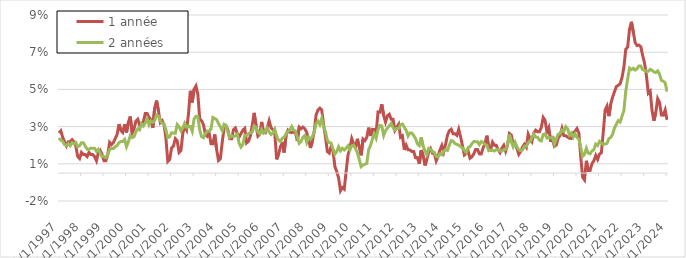
| Category | 1 année | 2 années |
|---|---|---|
| 1/1/97 | 0.022 | 0.019 |
| 2/1/97 | 0.023 | 0.018 |
| 3/1/97 | 0.019 | 0.017 |
| 4/1/97 | 0.017 | 0.015 |
| 5/1/97 | 0.015 | 0.015 |
| 6/1/97 | 0.017 | 0.016 |
| 7/1/97 | 0.017 | 0.015 |
| 8/1/97 | 0.018 | 0.016 |
| 9/1/97 | 0.017 | 0.016 |
| 10/1/97 | 0.015 | 0.016 |
| 11/1/97 | 0.009 | 0.014 |
| 12/1/97 | 0.008 | 0.015 |
| 1/1/98 | 0.011 | 0.016 |
| 2/1/98 | 0.01 | 0.016 |
| 3/1/98 | 0.01 | 0.015 |
| 4/1/98 | 0.009 | 0.013 |
| 5/1/98 | 0.011 | 0.013 |
| 6/1/98 | 0.01 | 0.013 |
| 7/1/98 | 0.01 | 0.013 |
| 8/1/98 | 0.009 | 0.013 |
| 9/1/98 | 0.007 | 0.012 |
| 10/1/98 | 0.011 | 0.013 |
| 11/1/98 | 0.012 | 0.011 |
| 12/1/98 | 0.01 | 0.009 |
| 1/1/99 | 0.007 | 0.009 |
| 2/1/99 | 0.007 | 0.008 |
| 3/1/99 | 0.01 | 0.01 |
| 4/1/99 | 0.016 | 0.013 |
| 5/1/99 | 0.015 | 0.013 |
| 6/1/99 | 0.016 | 0.013 |
| 7/1/99 | 0.019 | 0.014 |
| 8/1/99 | 0.021 | 0.015 |
| 9/1/99 | 0.026 | 0.016 |
| 10/1/99 | 0.023 | 0.017 |
| 11/1/99 | 0.022 | 0.017 |
| 12/1/99 | 0.026 | 0.018 |
| 1/1/00 | 0.022 | 0.014 |
| 2/1/00 | 0.027 | 0.017 |
| 3/1/00 | 0.03 | 0.02 |
| 4/1/00 | 0.022 | 0.019 |
| 5/1/00 | 0.024 | 0.02 |
| 6/1/00 | 0.028 | 0.022 |
| 7/1/00 | 0.029 | 0.024 |
| 8/1/00 | 0.026 | 0.023 |
| 9/1/00 | 0.027 | 0.027 |
| 10/1/00 | 0.028 | 0.025 |
| 11/1/00 | 0.032 | 0.027 |
| 12/1/00 | 0.032 | 0.029 |
| 1/1/01 | 0.03 | 0.026 |
| 2/1/01 | 0.029 | 0.028 |
| 3/1/01 | 0.024 | 0.027 |
| 4/1/01 | 0.035 | 0.028 |
| 5/1/01 | 0.039 | 0.031 |
| 6/1/01 | 0.034 | 0.031 |
| 7/1/01 | 0.027 | 0.028 |
| 8/1/01 | 0.028 | 0.027 |
| 9/1/01 | 0.026 | 0.026 |
| 10/1/01 | 0.019 | 0.023 |
| 11/1/01 | 0.006 | 0.019 |
| 12/1/01 | 0.007 | 0.02 |
| 1/1/02 | 0.013 | 0.022 |
| 2/1/02 | 0.014 | 0.022 |
| 3/1/02 | 0.019 | 0.021 |
| 4/1/02 | 0.017 | 0.026 |
| 5/1/02 | 0.011 | 0.025 |
| 6/1/02 | 0.012 | 0.023 |
| 7/1/02 | 0.021 | 0.024 |
| 8/1/02 | 0.025 | 0.027 |
| 9/1/02 | 0.023 | 0.025 |
| 10/1/02 | 0.032 | 0.025 |
| 11/1/02 | 0.044 | 0.025 |
| 12/1/02 | 0.038 | 0.022 |
| 1/1/03 | 0.045 | 0.029 |
| 2/1/03 | 0.047 | 0.031 |
| 3/1/03 | 0.042 | 0.03 |
| 4/1/03 | 0.029 | 0.023 |
| 5/1/03 | 0.028 | 0.02 |
| 6/1/03 | 0.026 | 0.019 |
| 7/1/03 | 0.021 | 0.021 |
| 8/1/03 | 0.02 | 0.023 |
| 9/1/03 | 0.022 | 0.023 |
| 10/1/03 | 0.016 | 0.024 |
| 11/1/03 | 0.016 | 0.03 |
| 12/1/03 | 0.021 | 0.029 |
| 1/1/04 | 0.013 | 0.029 |
| 2/1/04 | 0.007 | 0.027 |
| 3/1/04 | 0.008 | 0.025 |
| 4/1/04 | 0.017 | 0.023 |
| 5/1/04 | 0.024 | 0.026 |
| 6/1/04 | 0.025 | 0.026 |
| 7/1/04 | 0.023 | 0.022 |
| 8/1/04 | 0.018 | 0.019 |
| 9/1/04 | 0.018 | 0.02 |
| 10/1/04 | 0.023 | 0.02 |
| 11/1/04 | 0.024 | 0.02 |
| 12/1/04 | 0.021 | 0.021 |
| 1/1/05 | 0.019 | 0.016 |
| 2/1/05 | 0.021 | 0.014 |
| 3/1/05 | 0.023 | 0.015 |
| 4/1/05 | 0.024 | 0.02 |
| 5/1/05 | 0.016 | 0.02 |
| 6/1/05 | 0.017 | 0.021 |
| 7/1/05 | 0.02 | 0.022 |
| 8/1/05 | 0.026 | 0.022 |
| 9/1/05 | 0.032 | 0.025 |
| 10/1/05 | 0.026 | 0.025 |
| 11/1/05 | 0.02 | 0.022 |
| 12/1/05 | 0.021 | 0.021 |
| 1/1/06 | 0.028 | 0.023 |
| 2/1/06 | 0.022 | 0.022 |
| 3/1/06 | 0.022 | 0.022 |
| 4/1/06 | 0.024 | 0.024 |
| 5/1/06 | 0.028 | 0.022 |
| 6/1/06 | 0.024 | 0.021 |
| 7/1/06 | 0.023 | 0.022 |
| 8/1/06 | 0.021 | 0.024 |
| 9/1/06 | 0.007 | 0.02 |
| 10/1/06 | 0.01 | 0.018 |
| 11/1/06 | 0.014 | 0.017 |
| 12/1/06 | 0.017 | 0.019 |
| 1/1/07 | 0.011 | 0.019 |
| 2/1/07 | 0.02 | 0.021 |
| 3/1/07 | 0.023 | 0.022 |
| 4/1/07 | 0.022 | 0.023 |
| 5/1/07 | 0.022 | 0.025 |
| 6/1/07 | 0.022 | 0.023 |
| 7/1/07 | 0.022 | 0.023 |
| 8/1/07 | 0.017 | 0.019 |
| 9/1/07 | 0.025 | 0.016 |
| 10/1/07 | 0.024 | 0.017 |
| 11/1/07 | 0.025 | 0.019 |
| 12/1/07 | 0.024 | 0.02 |
| 1/1/08 | 0.022 | 0.016 |
| 2/1/08 | 0.018 | 0.019 |
| 3/1/08 | 0.014 | 0.018 |
| 4/1/08 | 0.017 | 0.019 |
| 5/1/08 | 0.022 | 0.022 |
| 6/1/08 | 0.031 | 0.027 |
| 7/1/08 | 0.034 | 0.028 |
| 8/1/08 | 0.035 | 0.026 |
| 9/1/08 | 0.034 | 0.029 |
| 10/1/08 | 0.026 | 0.025 |
| 11/1/08 | 0.02 | 0.022 |
| 12/1/08 | 0.012 | 0.018 |
| 1/1/09 | 0.011 | 0.016 |
| 2/1/09 | 0.014 | 0.016 |
| 3/1/09 | 0.012 | 0.013 |
| 4/1/09 | 0.004 | 0.01 |
| 5/1/09 | 0.001 | 0.012 |
| 6/1/09 | -0.003 | 0.014 |
| 7/1/09 | -0.009 | 0.012 |
| 8/1/09 | -0.008 | 0.013 |
| 9/1/09 | -0.009 | 0.012 |
| 10/1/09 | 0.001 | 0.013 |
| 11/1/09 | 0.01 | 0.015 |
| 12/1/09 | 0.013 | 0.012 |
| 1/1/10 | 0.019 | 0.015 |
| 2/1/10 | 0.016 | 0.015 |
| 3/1/10 | 0.014 | 0.013 |
| 4/1/10 | 0.018 | 0.011 |
| 5/1/10 | 0.014 | 0.007 |
| 6/1/10 | 0.01 | 0.003 |
| 7/1/10 | 0.018 | 0.004 |
| 8/1/10 | 0.017 | 0.005 |
| 9/1/10 | 0.019 | 0.005 |
| 10/1/10 | 0.024 | 0.013 |
| 11/1/10 | 0.02 | 0.015 |
| 12/1/10 | 0.024 | 0.018 |
| 1/1/11 | 0.023 | 0.021 |
| 2/1/11 | 0.022 | 0.019 |
| 3/1/11 | 0.033 | 0.023 |
| 4/1/11 | 0.033 | 0.026 |
| 5/1/11 | 0.037 | 0.025 |
| 6/1/11 | 0.031 | 0.02 |
| 7/1/11 | 0.027 | 0.023 |
| 8/1/11 | 0.031 | 0.024 |
| 9/1/11 | 0.032 | 0.025 |
| 10/1/11 | 0.029 | 0.027 |
| 11/1/11 | 0.029 | 0.024 |
| 12/1/11 | 0.023 | 0.023 |
| 1/1/12 | 0.025 | 0.024 |
| 2/1/12 | 0.026 | 0.024 |
| 3/1/12 | 0.019 | 0.026 |
| 4/1/12 | 0.02 | 0.026 |
| 5/1/12 | 0.012 | 0.025 |
| 6/1/12 | 0.015 | 0.023 |
| 7/1/12 | 0.012 | 0.02 |
| 8/1/12 | 0.012 | 0.022 |
| 9/1/12 | 0.012 | 0.022 |
| 10/1/12 | 0.012 | 0.02 |
| 11/1/12 | 0.008 | 0.019 |
| 12/1/12 | 0.008 | 0.016 |
| 1/1/13 | 0.005 | 0.015 |
| 2/1/13 | 0.012 | 0.019 |
| 3/1/13 | 0.01 | 0.015 |
| 4/1/13 | 0.004 | 0.012 |
| 5/1/13 | 0.007 | 0.01 |
| 6/1/13 | 0.012 | 0.013 |
| 7/1/13 | 0.013 | 0.013 |
| 8/1/13 | 0.011 | 0.012 |
| 9/1/13 | 0.011 | 0.011 |
| 10/1/13 | 0.007 | 0.009 |
| 11/1/13 | 0.009 | 0.009 |
| 12/1/13 | 0.012 | 0.01 |
| 1/1/14 | 0.015 | 0.01 |
| 2/1/14 | 0.011 | 0.012 |
| 3/1/14 | 0.015 | 0.013 |
| 4/1/14 | 0.02 | 0.012 |
| 5/1/14 | 0.023 | 0.015 |
| 6/1/14 | 0.024 | 0.018 |
| 7/1/14 | 0.021 | 0.017 |
| 8/1/14 | 0.021 | 0.016 |
| 9/1/14 | 0.02 | 0.015 |
| 10/1/14 | 0.024 | 0.015 |
| 11/1/14 | 0.02 | 0.014 |
| 12/1/14 | 0.015 | 0.014 |
| 1/1/15 | 0.01 | 0.012 |
| 2/1/15 | 0.01 | 0.011 |
| 3/1/15 | 0.012 | 0.014 |
| 4/1/15 | 0.008 | 0.014 |
| 5/1/15 | 0.009 | 0.016 |
| 6/1/15 | 0.01 | 0.017 |
| 7/1/15 | 0.013 | 0.017 |
| 8/1/15 | 0.013 | 0.017 |
| 9/1/15 | 0.01 | 0.015 |
| 10/1/15 | 0.01 | 0.017 |
| 11/1/15 | 0.014 | 0.017 |
| 12/1/15 | 0.016 | 0.015 |
| 1/1/16 | 0.02 | 0.015 |
| 2/1/16 | 0.014 | 0.012 |
| 3/1/16 | 0.013 | 0.012 |
| 4/1/16 | 0.017 | 0.012 |
| 5/1/16 | 0.015 | 0.012 |
| 6/1/16 | 0.015 | 0.013 |
| 7/1/16 | 0.013 | 0.013 |
| 8/1/16 | 0.011 | 0.012 |
| 9/1/16 | 0.013 | 0.012 |
| 10/1/16 | 0.015 | 0.013 |
| 11/1/16 | 0.012 | 0.013 |
| 12/1/16 | 0.015 | 0.016 |
| 1/1/17 | 0.021 | 0.021 |
| 2/1/17 | 0.02 | 0.017 |
| 3/1/17 | 0.016 | 0.014 |
| 4/1/17 | 0.016 | 0.017 |
| 5/1/17 | 0.013 | 0.014 |
| 6/1/17 | 0.01 | 0.013 |
| 7/1/17 | 0.012 | 0.012 |
| 8/1/17 | 0.014 | 0.012 |
| 9/1/17 | 0.016 | 0.014 |
| 10/1/17 | 0.014 | 0.014 |
| 11/1/17 | 0.021 | 0.016 |
| 12/1/17 | 0.019 | 0.017 |
| 1/1/18 | 0.017 | 0.019 |
| 2/1/18 | 0.022 | 0.021 |
| 3/1/18 | 0.023 | 0.019 |
| 4/1/18 | 0.022 | 0.019 |
| 5/1/18 | 0.022 | 0.018 |
| 6/1/18 | 0.025 | 0.017 |
| 7/1/18 | 0.03 | 0.021 |
| 8/1/18 | 0.028 | 0.021 |
| 9/1/18 | 0.022 | 0.019 |
| 10/1/18 | 0.024 | 0.019 |
| 11/1/18 | 0.017 | 0.019 |
| 12/1/18 | 0.02 | 0.019 |
| 1/1/19 | 0.014 | 0.016 |
| 2/1/19 | 0.015 | 0.018 |
| 3/1/19 | 0.019 | 0.021 |
| 4/1/19 | 0.02 | 0.021 |
| 5/1/19 | 0.024 | 0.023 |
| 6/1/19 | 0.02 | 0.022 |
| 7/1/19 | 0.02 | 0.025 |
| 8/1/19 | 0.019 | 0.024 |
| 9/1/19 | 0.019 | 0.02 |
| 10/1/19 | 0.019 | 0.022 |
| 11/1/19 | 0.022 | 0.019 |
| 12/1/19 | 0.022 | 0.021 |
| 1/1/20 | 0.024 | 0.019 |
| 2/1/20 | 0.022 | 0.018 |
| 3/1/20 | 0.009 | 0.014 |
| 4/1/20 | -0.002 | 0.009 |
| 5/1/20 | -0.004 | 0.01 |
| 6/1/20 | 0.007 | 0.013 |
| 7/1/20 | 0.001 | 0.011 |
| 8/1/20 | 0.001 | 0.01 |
| 9/1/20 | 0.005 | 0.012 |
| 10/1/20 | 0.007 | 0.013 |
| 11/1/20 | 0.01 | 0.016 |
| 12/1/20 | 0.007 | 0.015 |
| 1/1/21 | 0.01 | 0.017 |
| 2/1/21 | 0.011 | 0.016 |
| 3/1/21 | 0.022 | 0.015 |
| 4/1/21 | 0.034 | 0.016 |
| 5/1/21 | 0.036 | 0.016 |
| 6/1/21 | 0.031 | 0.019 |
| 7/1/21 | 0.037 | 0.019 |
| 8/1/21 | 0.041 | 0.021 |
| 9/1/21 | 0.044 | 0.024 |
| 10/1/21 | 0.047 | 0.026 |
| 11/1/21 | 0.047 | 0.028 |
| 12/1/21 | 0.048 | 0.027 |
| 1/1/22 | 0.051 | 0.031 |
| 2/1/22 | 0.057 | 0.034 |
| 3/1/22 | 0.067 | 0.044 |
| 4/1/22 | 0.068 | 0.051 |
| 5/1/22 | 0.077 | 0.056 |
| 6/1/22 | 0.081 | 0.056 |
| 7/1/22 | 0.076 | 0.056 |
| 8/1/22 | 0.07 | 0.055 |
| 9/1/22 | 0.069 | 0.056 |
| 10/1/22 | 0.069 | 0.058 |
| 11/1/22 | 0.068 | 0.058 |
| 12/1/22 | 0.063 | 0.056 |
| 1/1/23 | 0.059 | 0.055 |
| 2/1/23 | 0.052 | 0.055 |
| 3/1/23 | 0.043 | 0.055 |
| 4/1/23 | 0.044 | 0.056 |
| 5/1/23 | 0.034 | 0.055 |
| 6/1/23 | 0.028 | 0.054 |
| 7/1/23 | 0.033 | 0.054 |
| 8/1/23 | 0.04 | 0.055 |
| 9/1/23 | 0.038 | 0.053 |
| 10/1/23 | 0.031 | 0.05 |
| 11/1/23 | 0.031 | 0.049 |
| 12/1/23 | 0.034 | 0.048 |
| 1/1/24 | 0.029 | 0.044 |